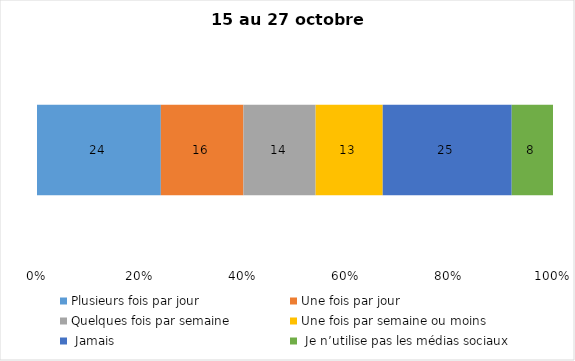
| Category | Plusieurs fois par jour | Une fois par jour | Quelques fois par semaine   | Une fois par semaine ou moins   |  Jamais   |  Je n’utilise pas les médias sociaux |
|---|---|---|---|---|---|---|
| 0 | 24 | 16 | 14 | 13 | 25 | 8 |